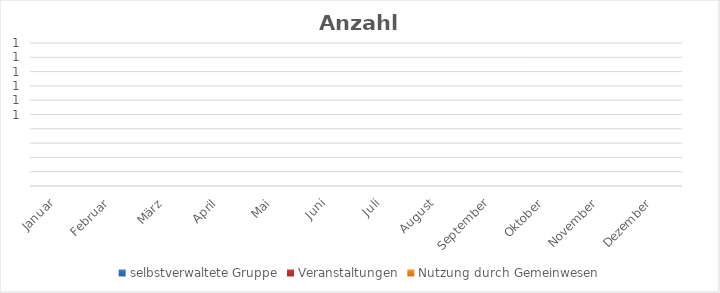
| Category | selbstverwaltete Gruppe | Veranstaltungen | Nutzung durch Gemeinwesen |
|---|---|---|---|
| Januar | 0 | 0 | 0 |
| Februar | 0 | 0 | 0 |
| März | 0 | 0 | 0 |
| April | 0 | 0 | 0 |
| Mai | 0 | 0 | 0 |
| Juni | 0 | 0 | 0 |
| Juli | 0 | 0 | 0 |
| August | 0 | 0 | 0 |
| September | 0 | 0 | 0 |
| Oktober | 0 | 0 | 0 |
| November | 0 | 0 | 0 |
| Dezember | 0 | 0 | 0 |